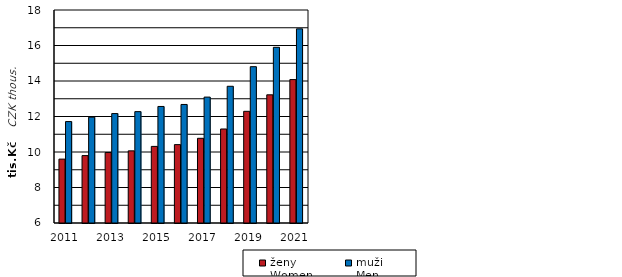
| Category | ženy  
Women | muži  
Men |
|---|---|---|
| 2011.0 | 9599 | 11714 |
| 2012.0 | 9797 | 11962 |
| 2013.0 | 9970 | 12165 |
| 2014.0 | 10065 | 12274 |
| 2015.0 | 10316 | 12566 |
| 2016.0 | 10416 | 12678 |
| 2017.0 | 10772 | 13093 |
| 2018.0 | 11296 | 13703 |
| 2019.0 | 12292 | 14807 |
| 2020.0 | 13221 | 15898 |
| 2021.0 | 14080 | 16938 |